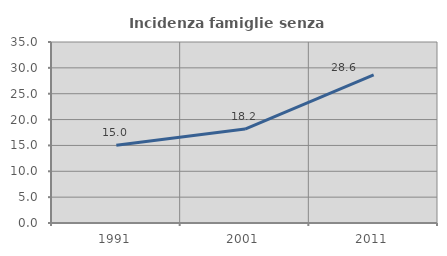
| Category | Incidenza famiglie senza nuclei |
|---|---|
| 1991.0 | 15.028 |
| 2001.0 | 18.171 |
| 2011.0 | 28.628 |